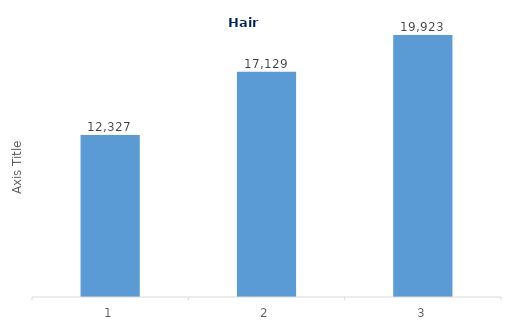
| Category | Series 0 |
|---|---|
| 0 | 12327 |
| 1 | 17129 |
| 2 | 19923 |